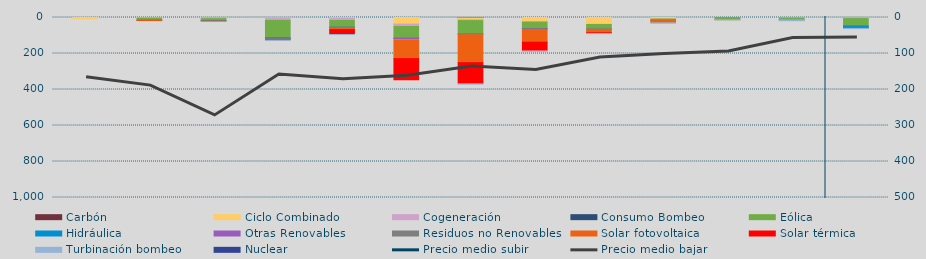
| Category | Carbón | Ciclo Combinado | Cogeneración | Consumo Bombeo | Eólica | Hidráulica | Otras Renovables | Residuos no Renovables | Solar fotovoltaica | Solar térmica | Turbinación bombeo | Nuclear |
|---|---|---|---|---|---|---|---|---|---|---|---|---|
| 0 | 0 | 7388.9 | 0 | 0 | 0 | 0 | 0 | 0 | 0 | 0 | 0 | 0 |
| 1 | 0 | 582 | 2829.7 | 0 | 11683.6 | 231.6 | 1182.5 | 0 | 155.2 | 1067.3 | 0 | 0 |
| 2 | 0 | 0 | 6237.3 | 0 | 10203.7 | 1917.8 | 944.6 | 0 | 48.1 | 0 | 0 | 0 |
| 3 | 0 | 1230 | 13598.7 | 0 | 97489.7 | 5402.7 | 1813.8 | 1013 | 3586.5 | 2430.1 | 317.4 | 0 |
| 4 | 0 | 3090.6 | 13474.7 | 0 | 37149 | 1123.6 | 3207.9 | 675 | 8550.9 | 27054.6 | 431 | 0 |
| 5 | 0 | 36734.9 | 12855.2 | 0 | 65071.5 | 1518 | 6583 | 675 | 105142.4 | 122842 | 0 | 0 |
| 6 | 2096 | 11203.8 | 3780.2 | 0 | 74938.3 | 359.9 | 3182.9 | 0 | 155352.2 | 119223.3 | 200 | 0 |
| 7 | 0 | 23416.9 | 1799.3 | 0 | 36710.1 | 169.9 | 2791.7 | 130.2 | 72190.6 | 49997.5 | 140 | 0 |
| 8 | 0 | 38168.9 | 488.4 | 0 | 26054.9 | 21.9 | 466.4 | 0 | 19329.3 | 4158.9 | 1184.2 | 0 |
| 9 | 0 | 7357.7 | 1214.8 | 0 | 7240.9 | 133.6 | 501.7 | 0 | 12900.5 | 0 | 280 | 0 |
| 10 | 0 | 0 | 195.2 | 0 | 11271.7 | 31.8 | 43.5 | 0 | 327.2 | 72.2 | 190.9 | 0 |
| 11 | 0 | 1594 | 466.5 | 0 | 10201.8 | 124.4 | 68.4 | 0 | 144.3 | 50.3 | 5089.6 | 0 |
| 12 | 0 | 0 | 5902.2 | 0 | 40924.6 | 10096 | 2210.8 | 541.2 | 397.2 | 861 | 700 | 0 |